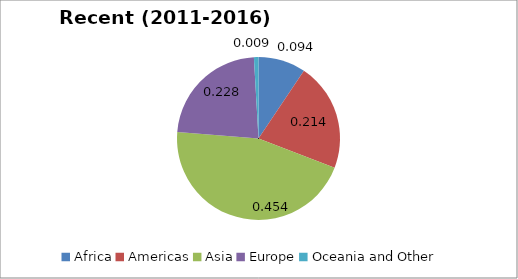
| Category | Series 0 |
|---|---|
| Africa | 0.094 |
| Americas | 0.214 |
| Asia | 0.454 |
| Europe | 0.228 |
| Oceania and Other | 0.009 |